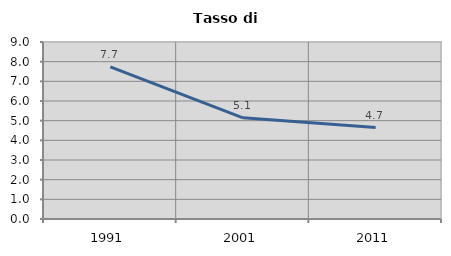
| Category | Tasso di disoccupazione   |
|---|---|
| 1991.0 | 7.74 |
| 2001.0 | 5.145 |
| 2011.0 | 4.651 |